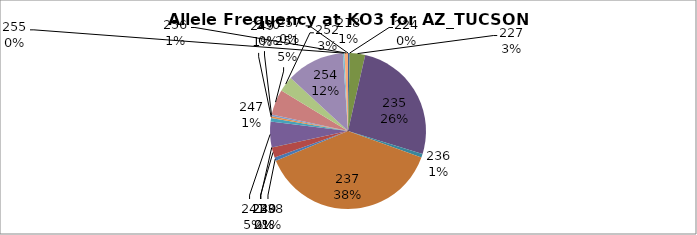
| Category | Series 0 |
|---|---|
| 218.0 | 0.004 |
| 224.0 | 0 |
| 227.0 | 0.032 |
| 235.0 | 0.262 |
| 236.0 | 0.007 |
| 237.0 | 0.383 |
| 238.0 | 0.007 |
| 239.0 | 0.021 |
| 240.0 | 0 |
| 241.0 | 0.053 |
| 247.0 | 0.007 |
| 249.0 | 0.004 |
| 250.0 | 0.004 |
| 251.0 | 0.053 |
| 252.0 | 0.032 |
| 254.0 | 0.121 |
| 255.0 | 0.004 |
| 256.0 | 0.007 |
| 257.0 | 0 |